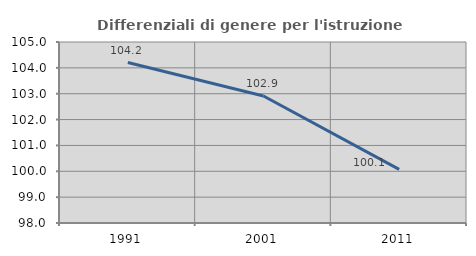
| Category | Differenziali di genere per l'istruzione superiore |
|---|---|
| 1991.0 | 104.205 |
| 2001.0 | 102.911 |
| 2011.0 | 100.074 |